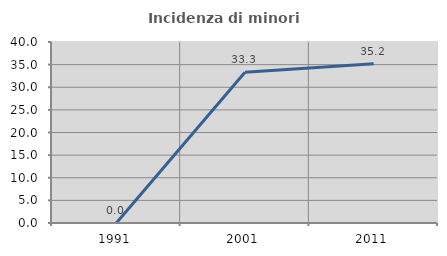
| Category | Incidenza di minori stranieri |
|---|---|
| 1991.0 | 0 |
| 2001.0 | 33.333 |
| 2011.0 | 35.192 |